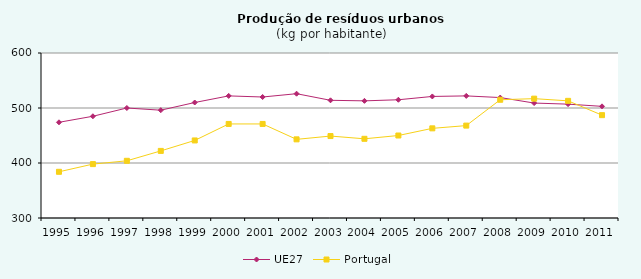
| Category | UE27 | Portugal |
|---|---|---|
| 1995.0 | 474 | 384 |
| 1996.0 | 485 | 398 |
| 1997.0 | 500 | 404 |
| 1998.0 | 496 | 422 |
| 1999.0 | 510 | 441 |
| 2000.0 | 522 | 471 |
| 2001.0 | 520 | 471 |
| 2002.0 | 526 | 443 |
| 2003.0 | 514 | 449 |
| 2004.0 | 513 | 444 |
| 2005.0 | 515 | 450 |
| 2006.0 | 521 | 463 |
| 2007.0 | 522 | 468 |
| 2008.0 | 519 | 515 |
| 2009.0 | 509 | 517 |
| 2010.0 | 507 | 513 |
| 2011.0 | 503 | 487 |